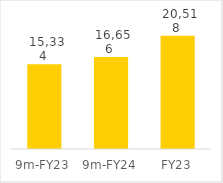
| Category | Series 0 |
|---|---|
| 9m-FY23 | 15334.394 |
| 9m-FY24 | 16656.044 |
| FY23 | 20517.534 |